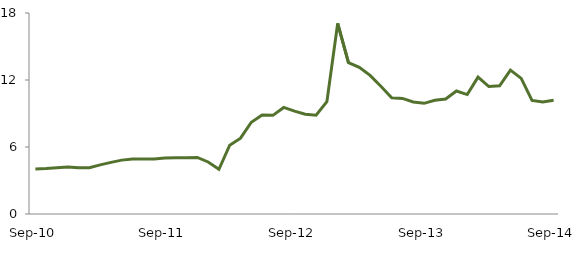
| Category | Series 0 |
|---|---|
| Sep-10 | 4.03 |
|  | 4.066 |
|  | 4.15 |
|  | 4.216 |
|  | 4.15 |
|  | 4.148 |
|  | 4.401 |
|  | 4.623 |
|  | 4.825 |
|  | 4.918 |
|  | 4.919 |
|  | 4.926 |
| Sep-11 | 5.012 |
|  | 5.043 |
|  | 5.038 |
|  | 5.067 |
|  | 4.66 |
|  | 4 |
|  | 6.158 |
|  | 6.787 |
|  | 8.219 |
|  | 8.867 |
|  | 8.834 |
|  | 9.545 |
| Sep-12 | 9.213 |
|  | 8.941 |
|  | 8.846 |
|  | 10.067 |
|  | 17.068 |
|  | 13.56 |
|  | 13.131 |
|  | 12.412 |
|  | 11.434 |
|  | 10.414 |
|  | 10.35 |
|  | 10.032 |
| Sep-13 | 9.912 |
|  | 10.18 |
|  | 10.298 |
|  | 11.017 |
|  | 10.695 |
|  | 12.26 |
|  | 11.417 |
|  | 11.48 |
|  | 12.892 |
|  | 12.148 |
|  | 10.169 |
|  | 10.032 |
| Sep-14 | 10.188 |